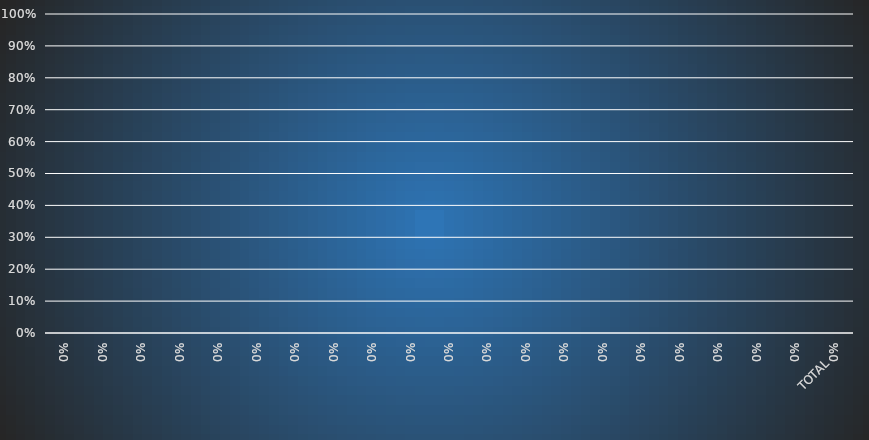
| Category | RENDIMENTO |
|---|---|
|  | 0 |
|  | 0 |
|  | 0 |
|  | 0 |
|  | 0 |
|  | 0 |
|  | 0 |
|  | 0 |
|  | 0 |
|  | 0 |
|  | 0 |
|  | 0 |
|  | 0 |
|  | 0 |
|  | 0 |
|  | 0 |
|  | 0 |
|  | 0 |
|  | 0 |
|  | 0 |
| TOTAL | 0 |